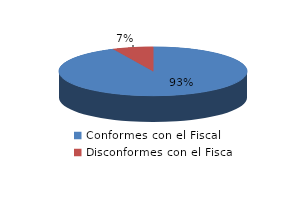
| Category | Series 0 |
|---|---|
| 0 | 67 |
| 1 | 5 |